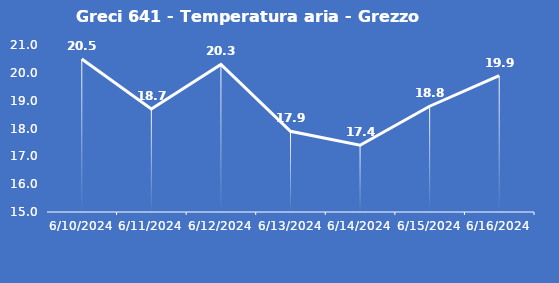
| Category | Greci 641 - Temperatura aria - Grezzo (°C) |
|---|---|
| 6/10/24 | 20.5 |
| 6/11/24 | 18.7 |
| 6/12/24 | 20.3 |
| 6/13/24 | 17.9 |
| 6/14/24 | 17.4 |
| 6/15/24 | 18.8 |
| 6/16/24 | 19.9 |